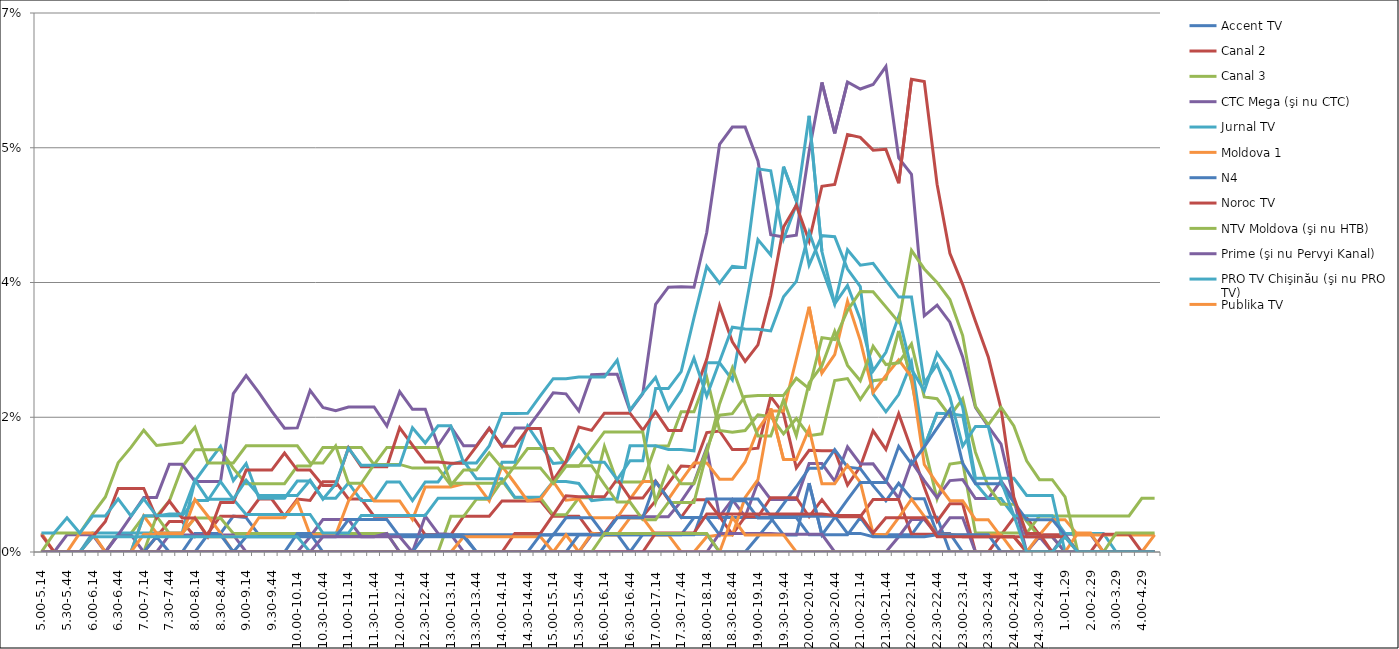
| Category | Accent TV | Canal 2 | Canal 3 | CTC Mega (şi nu CTC) | Jurnal TV | Moldova 1 | N4 | Noroc TV | NTV Moldova (şi nu HTB) | Prime (şi nu Pervyi Kanal) | PRO TV Chişinău (şi nu PRO TV) | Publika TV  | REN-TV Moldova (şi nu REN TV)  | RTR Moldova( şi nu PTP)  | THT Exclusiv (şi nu THT) | TV8 | TVC 21 | TVR MOLDOVA (şi nu TVR) | Canal Regional | Familia Domashniy | ITV | Moldova 2 | Alt canal |
|---|---|---|---|---|---|---|---|---|---|---|---|---|---|---|---|---|---|---|---|---|---|---|---|
| 5.00-5.14 | 0 | 0 | 0 | 0 | 0 | 0 | 0 | 0 | 0 | 0 | 0 | 0.002 | 0 | 0.002 | 0 | 0 | 0 | 0 | 0 | 0 | 0 | 0 | 0.002 |
| 5.15-5.29 | 0 | 0 | 0 | 0 | 0 | 0 | 0 | 0 | 0 | 0 | 0 | 0 | 0 | 0 | 0.002 | 0 | 0 | 0 | 0 | 0 | 0 | 0 | 0.002 |
| 5.30-5.44 | 0 | 0 | 0 | 0 | 0 | 0 | 0 | 0 | 0 | 0.002 | 0 | 0 | 0 | 0 | 0.002 | 0 | 0 | 0 | 0 | 0 | 0 | 0 | 0.004 |
| 5.45-5.59 | 0 | 0 | 0 | 0 | 0 | 0 | 0 | 0 | 0 | 0.002 | 0 | 0.002 | 0 | 0 | 0.002 | 0 | 0 | 0 | 0 | 0 | 0 | 0 | 0.002 |
| 6.00-6.14 | 0 | 0 | 0 | 0 | 0.002 | 0 | 0 | 0 | 0 | 0.002 | 0 | 0.002 | 0 | 0.002 | 0.005 | 0 | 0.002 | 0 | 0 | 0 | 0 | 0 | 0.005 |
| 6.15-6.29 | 0 | 0 | 0 | 0 | 0.002 | 0 | 0 | 0 | 0 | 0 | 0 | 0 | 0 | 0.004 | 0.007 | 0 | 0.002 | 0 | 0 | 0 | 0 | 0 | 0.005 |
| 6.30-6.44 | 0 | 0 | 0.002 | 0.002 | 0.002 | 0 | 0 | 0 | 0 | 0.002 | 0 | 0 | 0 | 0.008 | 0.012 | 0 | 0.002 | 0 | 0 | 0 | 0 | 0 | 0.007 |
| 6.45-6.59 | 0 | 0 | 0.002 | 0.002 | 0.002 | 0 | 0 | 0 | 0 | 0.005 | 0 | 0 | 0 | 0.008 | 0.014 | 0 | 0.002 | 0 | 0 | 0 | 0 | 0 | 0.005 |
| 7.00-7.14 | 0 | 0 | 0.005 | 0 | 0.002 | 0.005 | 0 | 0 | 0 | 0.007 | 0.005 | 0.002 | 0 | 0.008 | 0.016 | 0 | 0.002 | 0 | 0 | 0 | 0 | 0 | 0.007 |
| 7.15-7.29 | 0 | 0.002 | 0.005 | 0 | 0.002 | 0.002 | 0 | 0 | 0.005 | 0.007 | 0.005 | 0.002 | 0.002 | 0.004 | 0.014 | 0 | 0.002 | 0 | 0 | 0 | 0 | 0 | 0.005 |
| 7.30-7.44 | 0 | 0.004 | 0.002 | 0.002 | 0.002 | 0.002 | 0 | 0 | 0.007 | 0.011 | 0.005 | 0.002 | 0 | 0.007 | 0.014 | 0 | 0.002 | 0 | 0 | 0 | 0 | 0 | 0.005 |
| 7.45-7.59 | 0 | 0.004 | 0.002 | 0.002 | 0.002 | 0.002 | 0 | 0 | 0.011 | 0.011 | 0.005 | 0.002 | 0 | 0.004 | 0.014 | 0 | 0.002 | 0 | 0 | 0 | 0 | 0 | 0.005 |
| 8.00-8.14 | 0.002 | 0.002 | 0.004 | 0.002 | 0.009 | 0.004 | 0 | 0 | 0.013 | 0.009 | 0.007 | 0.007 | 0 | 0.004 | 0.016 | 0 | 0.002 | 0 | 0 | 0 | 0 | 0 | 0.009 |
| 8.15-8.29 | 0.002 | 0.002 | 0.004 | 0.002 | 0.012 | 0.002 | 0 | 0 | 0.013 | 0.009 | 0.007 | 0.005 | 0.002 | 0.002 | 0.012 | 0 | 0.002 | 0 | 0 | 0 | 0 | 0 | 0.007 |
| 8.30-8.44 | 0.002 | 0.005 | 0.004 | 0.002 | 0.014 | 0.002 | 0 | 0 | 0.013 | 0.009 | 0.009 | 0.002 | 0.002 | 0.006 | 0.012 | 0 | 0.002 | 0 | 0 | 0 | 0 | 0 | 0.007 |
| 8.45-8.59 | 0.005 | 0.005 | 0.002 | 0.002 | 0.009 | 0.002 | 0 | 0 | 0.011 | 0.021 | 0.007 | 0 | 0 | 0.006 | 0.012 | 0 | 0.002 | 0 | 0 | 0 | 0 | 0 | 0.007 |
| 9.00-9.14 | 0.004 | 0.005 | 0.002 | 0 | 0.011 | 0.002 | 0 | 0 | 0.009 | 0.023 | 0.005 | 0 | 0.002 | 0.011 | 0.014 | 0 | 0.002 | 0 | 0 | 0 | 0 | 0 | 0.009 |
| 9.15-9.29 | 0.002 | 0.007 | 0.002 | 0 | 0.007 | 0.004 | 0 | 0 | 0.009 | 0.021 | 0.005 | 0 | 0.002 | 0.011 | 0.014 | 0 | 0.002 | 0 | 0 | 0 | 0 | 0 | 0.007 |
| 9.30-9.44 | 0.002 | 0.007 | 0.002 | 0 | 0.007 | 0.004 | 0 | 0 | 0.009 | 0.018 | 0.005 | 0 | 0.002 | 0.011 | 0.014 | 0 | 0.002 | 0 | 0 | 0 | 0 | 0 | 0.007 |
| 9.45-9.59 | 0.002 | 0.005 | 0.002 | 0 | 0.007 | 0.004 | 0 | 0 | 0.009 | 0.016 | 0.005 | 0 | 0.002 | 0.013 | 0.014 | 0 | 0.002 | 0 | 0 | 0 | 0 | 0 | 0.007 |
| 10.00-10.14 | 0.002 | 0.007 | 0.002 | 0 | 0.009 | 0.007 | 0.002 | 0 | 0.011 | 0.016 | 0.005 | 0 | 0.002 | 0.011 | 0.014 | 0 | 0.002 | 0 | 0 | 0 | 0 | 0 | 0.007 |
| 10.15-10.29 | 0.002 | 0.007 | 0.002 | 0.002 | 0.009 | 0.002 | 0.002 | 0 | 0.011 | 0.021 | 0.005 | 0 | 0.002 | 0.011 | 0.012 | 0 | 0 | 0 | 0 | 0 | 0 | 0 | 0.009 |
| 10.30-10.44 | 0.002 | 0.009 | 0.002 | 0.004 | 0.007 | 0.002 | 0 | 0 | 0.014 | 0.019 | 0.002 | 0 | 0.002 | 0.009 | 0.012 | 0.002 | 0 | 0 | 0 | 0 | 0 | 0 | 0.007 |
| 10.45-10.59 | 0.002 | 0.009 | 0.002 | 0.004 | 0.007 | 0.002 | 0 | 0 | 0.014 | 0.018 | 0.002 | 0 | 0.002 | 0.009 | 0.014 | 0.002 | 0 | 0 | 0 | 0 | 0 | 0 | 0.009 |
| 11.00-11.14 | 0.002 | 0.007 | 0.002 | 0.004 | 0.009 | 0.007 | 0 | 0 | 0.014 | 0.019 | 0.002 | 0 | 0.004 | 0.014 | 0.009 | 0.002 | 0 | 0 | 0 | 0 | 0 | 0 | 0.013 |
| 11.15-11.29 | 0.002 | 0.007 | 0.002 | 0.002 | 0.007 | 0.009 | 0 | 0 | 0.014 | 0.019 | 0.005 | 0 | 0.004 | 0.011 | 0.009 | 0.002 | 0 | 0 | 0 | 0 | 0 | 0 | 0.011 |
| 11.30-11.44 | 0.002 | 0.005 | 0.002 | 0.002 | 0.007 | 0.007 | 0 | 0 | 0.011 | 0.019 | 0.005 | 0 | 0.004 | 0.011 | 0.011 | 0.002 | 0 | 0 | 0 | 0 | 0 | 0 | 0.011 |
| 11.45-11.59 | 0.002 | 0.005 | 0.002 | 0.002 | 0.009 | 0.007 | 0 | 0 | 0.014 | 0.016 | 0.005 | 0 | 0.004 | 0.011 | 0.011 | 0.002 | 0 | 0 | 0 | 0 | 0 | 0 | 0.011 |
| 12.00-12.14 | 0.002 | 0.005 | 0 | 0 | 0.009 | 0.007 | 0 | 0 | 0.014 | 0.021 | 0.005 | 0 | 0.002 | 0.016 | 0.011 | 0.002 | 0 | 0 | 0 | 0 | 0 | 0 | 0.011 |
| 12.15-12.29 | 0.002 | 0.005 | 0 | 0 | 0.007 | 0.004 | 0 | 0 | 0.014 | 0.019 | 0.005 | 0 | 0.002 | 0.014 | 0.011 | 0 | 0 | 0 | 0 | 0 | 0 | 0 | 0.016 |
| 12.30-12.44 | 0.002 | 0.002 | 0 | 0.005 | 0.009 | 0.008 | 0.002 | 0 | 0.014 | 0.019 | 0.005 | 0 | 0.002 | 0.012 | 0.011 | 0 | 0 | 0 | 0 | 0 | 0 | 0 | 0.014 |
| 12.45-12.59 | 0.002 | 0.002 | 0 | 0.002 | 0.009 | 0.008 | 0.002 | 0 | 0.014 | 0.014 | 0.007 | 0 | 0.002 | 0.012 | 0.011 | 0 | 0 | 0 | 0 | 0 | 0 | 0 | 0.016 |
| 13.00-13.14 | 0.002 | 0.002 | 0.005 | 0.002 | 0.011 | 0.008 | 0.002 | 0 | 0.009 | 0.016 | 0.007 | 0 | 0.002 | 0.012 | 0.009 | 0 | 0 | 0 | 0 | 0 | 0 | 0 | 0.016 |
| 13.15-13.29 | 0.002 | 0.005 | 0.005 | 0 | 0.012 | 0.009 | 0.002 | 0 | 0.009 | 0.014 | 0.007 | 0.002 | 0.002 | 0.012 | 0.011 | 0 | 0 | 0 | 0 | 0 | 0 | 0 | 0.012 |
| 13.30-13.44 | 0.002 | 0.005 | 0.007 | 0 | 0.01 | 0.009 | 0 | 0 | 0.009 | 0.014 | 0.007 | 0.002 | 0 | 0.014 | 0.011 | 0 | 0 | 0 | 0 | 0 | 0 | 0 | 0.012 |
| 13.45-13.59 | 0.002 | 0.005 | 0.007 | 0 | 0.01 | 0.007 | 0 | 0 | 0.009 | 0.016 | 0.007 | 0.002 | 0 | 0.016 | 0.013 | 0 | 0 | 0 | 0 | 0 | 0 | 0 | 0.014 |
| 14.00-14.14 | 0.002 | 0.007 | 0.009 | 0 | 0.01 | 0.011 | 0 | 0 | 0.009 | 0.014 | 0.012 | 0.002 | 0 | 0.014 | 0.011 | 0 | 0 | 0 | 0 | 0 | 0 | 0 | 0.018 |
| 14.15-14.29 | 0.002 | 0.007 | 0.007 | 0 | 0.007 | 0.009 | 0 | 0.002 | 0.011 | 0.016 | 0.012 | 0.002 | 0 | 0.014 | 0.011 | 0 | 0 | 0 | 0 | 0 | 0 | 0 | 0.018 |
| 14.30-14.44 | 0.002 | 0.007 | 0.007 | 0 | 0.007 | 0.007 | 0 | 0.002 | 0.013 | 0.016 | 0.016 | 0.002 | 0 | 0.016 | 0.011 | 0 | 0 | 0 | 0 | 0 | 0 | 0 | 0.018 |
| 14.45-14.59 | 0.002 | 0.007 | 0.007 | 0 | 0.007 | 0.007 | 0 | 0.002 | 0.013 | 0.018 | 0.014 | 0.002 | 0.002 | 0.016 | 0.011 | 0 | 0 | 0 | 0 | 0 | 0 | 0 | 0.02 |
| 15.00-15.14 | 0.002 | 0.005 | 0.005 | 0 | 0.009 | 0.009 | 0.002 | 0.005 | 0.013 | 0.021 | 0.011 | 0 | 0.002 | 0.009 | 0.009 | 0 | 0 | 0 | 0 | 0 | 0 | 0 | 0.023 |
| 15.15-15.29 | 0.002 | 0.005 | 0.005 | 0 | 0.009 | 0.007 | 0.002 | 0.007 | 0.011 | 0.021 | 0.012 | 0.002 | 0.004 | 0.012 | 0.011 | 0 | 0 | 0 | 0 | 0 | 0 | 0 | 0.023 |
| 15.30-15.44 | 0.002 | 0.005 | 0.007 | 0 | 0.009 | 0.007 | 0.002 | 0.007 | 0.011 | 0.018 | 0.014 | 0 | 0.004 | 0.016 | 0.011 | 0 | 0 | 0 | 0.002 | 0 | 0 | 0 | 0.023 |
| 15.45-15.59 | 0.002 | 0.002 | 0.007 | 0.002 | 0.007 | 0.004 | 0.002 | 0.007 | 0.011 | 0.023 | 0.012 | 0.002 | 0.004 | 0.016 | 0.013 | 0 | 0 | 0 | 0.002 | 0 | 0 | 0 | 0.023 |
| 16.00-16.14 | 0.002 | 0.002 | 0.014 | 0.002 | 0.007 | 0.004 | 0.002 | 0.007 | 0.009 | 0.023 | 0.012 | 0.002 | 0.002 | 0.018 | 0.016 | 0 | 0 | 0 | 0.002 | 0 | 0.002 | 0 | 0.023 |
| 16.15-16.29 | 0.002 | 0.005 | 0.009 | 0.005 | 0.007 | 0.004 | 0.002 | 0.009 | 0.006 | 0.023 | 0.009 | 0.002 | 0.004 | 0.018 | 0.016 | 0 | 0 | 0 | 0.002 | 0 | 0.002 | 0 | 0.025 |
| 16.30-16.44 | 0.002 | 0.005 | 0.009 | 0.005 | 0.014 | 0.007 | 0 | 0.007 | 0.006 | 0.018 | 0.012 | 0.004 | 0.004 | 0.018 | 0.016 | 0 | 0 | 0 | 0.002 | 0 | 0.002 | 0 | 0.018 |
| 16.45-16.59 | 0.002 | 0.005 | 0.009 | 0.005 | 0.014 | 0.009 | 0.002 | 0.007 | 0.004 | 0.021 | 0.012 | 0.004 | 0.004 | 0.016 | 0.016 | 0 | 0 | 0 | 0.002 | 0 | 0.002 | 0 | 0.021 |
| 17.00-17.14 | 0.002 | 0.007 | 0.014 | 0.005 | 0.014 | 0.009 | 0.002 | 0.009 | 0.004 | 0.032 | 0.021 | 0.002 | 0.009 | 0.018 | 0.006 | 0 | 0 | 0 | 0.002 | 0.002 | 0.002 | 0 | 0.023 |
| 17.15-17.29 | 0.002 | 0.009 | 0.014 | 0.005 | 0.013 | 0.007 | 0.002 | 0.007 | 0.006 | 0.034 | 0.021 | 0.002 | 0.007 | 0.016 | 0.011 | 0 | 0 | 0 | 0.002 | 0.002 | 0.002 | 0 | 0.018 |
| 17.30-17.44 | 0.002 | 0.011 | 0.018 | 0.007 | 0.013 | 0.009 | 0.002 | 0.005 | 0.006 | 0.034 | 0.023 | 0 | 0.004 | 0.016 | 0.009 | 0 | 0 | 0 | 0.002 | 0.002 | 0.002 | 0 | 0.021 |
| 17.45-17.59 | 0.004 | 0.011 | 0.018 | 0.009 | 0.013 | 0.012 | 0.002 | 0.007 | 0.006 | 0.034 | 0.03 | 0 | 0.004 | 0.02 | 0.009 | 0 | 0 | 0 | 0.002 | 0.002 | 0.002 | 0 | 0.025 |
| 18.00-18.14 | 0.004 | 0.016 | 0.023 | 0.014 | 0.025 | 0.012 | 0.002 | 0.007 | 0.013 | 0.041 | 0.037 | 0.002 | 0.004 | 0.025 | 0.013 | 0 | 0 | 0 | 0.007 | 0.005 | 0.002 | 0 | 0.02 |
| 18.15-18.29 | 0.004 | 0.016 | 0.016 | 0.005 | 0.025 | 0.009 | 0 | 0.005 | 0.019 | 0.053 | 0.035 | 0.002 | 0.002 | 0.032 | 0.018 | 0.002 | 0 | 0 | 0.007 | 0.005 | 0 | 0 | 0.025 |
| 18.30-18.44 | 0.004 | 0.013 | 0.016 | 0.007 | 0.022 | 0.009 | 0 | 0.002 | 0.024 | 0.055 | 0.037 | 0.002 | 0.007 | 0.027 | 0.018 | 0.002 | 0 | 0.005 | 0.007 | 0.005 | 0 | 0 | 0.029 |
| 18.45-18.59 | 0.004 | 0.013 | 0.016 | 0.005 | 0.032 | 0.012 | 0 | 0.005 | 0.019 | 0.055 | 0.037 | 0.007 | 0.007 | 0.025 | 0.02 | 0.002 | 0 | 0.002 | 0.007 | 0.005 | 0 | 0 | 0.029 |
| 19.00-19.14 | 0.004 | 0.013 | 0.018 | 0.009 | 0.041 | 0.016 | 0.002 | 0.005 | 0.015 | 0.051 | 0.05 | 0.009 | 0.004 | 0.027 | 0.02 | 0.002 | 0 | 0.002 | 0.007 | 0.005 | 0 | 0 | 0.029 |
| 19.15-19.29 | 0.004 | 0.02 | 0.018 | 0.007 | 0.039 | 0.018 | 0.004 | 0.007 | 0.015 | 0.041 | 0.05 | 0.019 | 0.004 | 0.033 | 0.02 | 0.002 | 0 | 0.002 | 0.005 | 0.005 | 0 | 0 | 0.029 |
| 19.30-19.44 | 0.004 | 0.018 | 0.015 | 0.007 | 0.05 | 0.018 | 0.006 | 0.007 | 0.02 | 0.041 | 0.041 | 0.012 | 0.002 | 0.042 | 0.02 | 0.002 | 0 | 0.002 | 0.005 | 0.005 | 0 | 0 | 0.033 |
| 19.45-19.59 | 0.004 | 0.011 | 0.017 | 0.007 | 0.046 | 0.025 | 0.008 | 0.007 | 0.015 | 0.041 | 0.045 | 0.012 | 0.002 | 0.045 | 0.023 | 0.002 | 0 | 0 | 0.005 | 0.005 | 0 | 0 | 0.035 |
| 20.00-20.14 | 0.002 | 0.013 | 0.015 | 0.011 | 0.037 | 0.032 | 0.011 | 0.005 | 0.022 | 0.052 | 0.057 | 0.016 | 0.009 | 0.04 | 0.021 | 0.002 | 0 | 0 | 0.005 | 0.005 | 0 | 0 | 0.042 |
| 20.15-20.29 | 0.002 | 0.013 | 0.015 | 0.011 | 0.041 | 0.023 | 0.011 | 0.007 | 0.024 | 0.061 | 0.039 | 0.009 | 0.002 | 0.047 | 0.028 | 0.002 | 0 | 0 | 0.005 | 0.005 | 0 | 0 | 0.037 |
| 20.30-20.44 | 0.002 | 0.013 | 0.022 | 0.009 | 0.041 | 0.026 | 0.013 | 0.005 | 0.029 | 0.054 | 0.032 | 0.009 | 0.005 | 0.048 | 0.028 | 0 | 0 | 0 | 0.005 | 0.005 | 0 | 0 | 0.032 |
| 20.45-20.59 | 0.002 | 0.009 | 0.023 | 0.014 | 0.037 | 0.033 | 0.011 | 0.005 | 0.024 | 0.061 | 0.035 | 0.011 | 0.007 | 0.054 | 0.031 | 0 | 0 | 0 | 0.002 | 0.005 | 0 | 0 | 0.039 |
| 21.00-21.14 | 0.004 | 0.011 | 0.02 | 0.011 | 0.034 | 0.027 | 0.011 | 0.005 | 0.022 | 0.06 | 0.03 | 0.009 | 0.009 | 0.054 | 0.034 | 0 | 0 | 0 | 0.002 | 0.005 | 0 | 0 | 0.037 |
| 21.15-21.29 | 0.002 | 0.016 | 0.022 | 0.011 | 0.02 | 0.021 | 0.009 | 0.007 | 0.027 | 0.061 | 0.024 | 0.002 | 0.009 | 0.052 | 0.034 | 0 | 0 | 0 | 0.002 | 0.002 | 0 | 0 | 0.037 |
| 21.30-21.44 | 0.002 | 0.013 | 0.022 | 0.009 | 0.018 | 0.023 | 0.007 | 0.007 | 0.024 | 0.063 | 0.026 | 0.002 | 0.009 | 0.052 | 0.032 | 0 | 0 | 0 | 0.002 | 0.004 | 0 | 0 | 0.035 |
| 21.45-21.59 | 0.002 | 0.018 | 0.029 | 0.007 | 0.02 | 0.025 | 0.009 | 0.007 | 0.025 | 0.051 | 0.031 | 0.004 | 0.014 | 0.048 | 0.03 | 0.002 | 0 | 0 | 0.002 | 0.004 | 0 | 0 | 0.033 |
| 22.00-22.14 | 0.002 | 0.013 | 0.022 | 0.012 | 0.025 | 0.023 | 0.007 | 0.002 | 0.027 | 0.049 | 0.024 | 0.007 | 0.011 | 0.061 | 0.039 | 0.004 | 0 | 0 | 0.002 | 0.004 | 0 | 0 | 0.033 |
| 22.15-22.29 | 0.005 | 0.008 | 0.014 | 0.009 | 0.014 | 0.011 | 0.007 | 0.002 | 0.02 | 0.031 | 0.021 | 0.005 | 0.014 | 0.061 | 0.037 | 0.004 | 0 | 0 | 0.002 | 0.004 | 0 | 0 | 0.022 |
| 22.30-22.44 | 0.005 | 0.004 | 0.007 | 0.007 | 0.018 | 0.009 | 0.002 | 0.002 | 0.02 | 0.032 | 0.026 | 0.002 | 0.016 | 0.048 | 0.035 | 0.002 | 0 | 0 | 0.002 | 0.002 | 0 | 0 | 0.024 |
| 22.45-22.59 | 0 | 0.006 | 0.011 | 0.009 | 0.018 | 0.007 | 0.002 | 0.002 | 0.018 | 0.03 | 0.023 | 0.002 | 0.018 | 0.039 | 0.033 | 0.004 | 0 | 0 | 0.002 | 0.002 | 0 | 0 | 0.02 |
| 23.00-23.14 | 0 | 0.006 | 0.012 | 0.009 | 0.018 | 0.007 | 0 | 0.002 | 0.02 | 0.025 | 0.019 | 0.002 | 0.012 | 0.035 | 0.028 | 0.004 | 0 | 0 | 0.002 | 0.002 | 0 | 0 | 0.014 |
| 23.15-23.29 | 0 | 0 | 0.002 | 0.007 | 0.009 | 0.004 | 0 | 0.002 | 0.013 | 0.019 | 0.01 | 0.002 | 0.009 | 0.03 | 0.019 | 0 | 0 | 0 | 0.002 | 0.002 | 0 | 0 | 0.016 |
| 23.30-23.44 | 0 | 0 | 0.002 | 0.007 | 0.007 | 0.004 | 0 | 0.002 | 0.008 | 0.016 | 0.01 | 0.002 | 0.009 | 0.025 | 0.016 | 0 | 0 | 0 | 0.002 | 0.002 | 0 | 0 | 0.016 |
| 23.45-23.59 | 0 | 0.002 | 0.002 | 0.009 | 0.007 | 0.002 | 0 | 0.002 | 0.006 | 0.014 | 0.01 | 0.002 | 0.009 | 0.019 | 0.019 | 0 | 0 | 0 | 0 | 0.002 | 0 | 0 | 0.009 |
| 24.00-24.14 | 0 | 0.004 | 0.002 | 0.007 | 0.005 | 0.002 | 0 | 0.002 | 0.006 | 0.007 | 0.01 | 0 | 0.006 | 0.007 | 0.016 | 0 | 0 | 0 | 0 | 0.002 | 0 | 0 | 0.005 |
| 24.15-24.29 | 0 | 0.004 | 0.002 | 0 | 0.005 | 0 | 0 | 0 | 0.004 | 0.002 | 0.007 | 0 | 0.004 | 0.002 | 0.012 | 0 | 0 | 0 | 0 | 0.002 | 0 | 0 | 0 |
| 24.30-24.44 | 0 | 0.002 | 0.005 | 0.002 | 0.005 | 0.002 | 0 | 0 | 0.002 | 0.002 | 0.007 | 0 | 0.004 | 0.002 | 0.009 | 0 | 0 | 0 | 0 | 0.002 | 0 | 0 | 0 |
| 24.45-24.59 | 0 | 0.002 | 0.005 | 0 | 0.005 | 0.004 | 0 | 0 | 0.002 | 0.002 | 0.007 | 0 | 0.004 | 0 | 0.009 | 0 | 0 | 0 | 0 | 0.002 | 0 | 0 | 0 |
| 1.00-1.29 | 0 | 0.002 | 0.005 | 0.002 | 0.002 | 0.004 | 0 | 0 | 0 | 0 | 0 | 0 | 0.002 | 0 | 0.007 | 0 | 0 | 0 | 0 | 0.002 | 0 | 0 | 0.002 |
| 1.30-1. 59 | 0 | 0 | 0.005 | 0.002 | 0.002 | 0.002 | 0 | 0 | 0 | 0 | 0 | 0 | 0 | 0 | 0 | 0 | 0 | 0.002 | 0 | 0 | 0 | 0 | 0 |
| 2.00-2.29 | 0 | 0 | 0.005 | 0.002 | 0.002 | 0.002 | 0 | 0 | 0 | 0 | 0 | 0 | 0 | 0 | 0 | 0 | 0 | 0.002 | 0 | 0 | 0 | 0 | 0 |
| 2.30-2.59 | 0 | 0 | 0.005 | 0 | 0.002 | 0.002 | 0 | 0 | 0 | 0 | 0 | 0 | 0 | 0.002 | 0 | 0 | 0 | 0 | 0 | 0 | 0 | 0 | 0 |
| 3.00-3.29 | 0 | 0 | 0.005 | 0 | 0 | 0.002 | 0 | 0 | 0 | 0 | 0 | 0 | 0 | 0.002 | 0.002 | 0 | 0 | 0 | 0 | 0 | 0 | 0 | 0 |
| 3.30-3.59 | 0 | 0 | 0.005 | 0 | 0 | 0.002 | 0 | 0 | 0 | 0 | 0 | 0 | 0 | 0.002 | 0.002 | 0 | 0 | 0 | 0 | 0 | 0 | 0 | 0 |
| 4.00-4.29 | 0 | 0 | 0.007 | 0 | 0 | 0.002 | 0 | 0 | 0 | 0 | 0 | 0 | 0 | 0 | 0.002 | 0 | 0 | 0 | 0 | 0 | 0 | 0 | 0 |
| 4.30-4.59 | 0 | 0 | 0.007 | 0 | 0 | 0.002 | 0 | 0 | 0 | 0 | 0 | 0.002 | 0 | 0 | 0.002 | 0 | 0 | 0 | 0 | 0 | 0 | 0 | 0 |